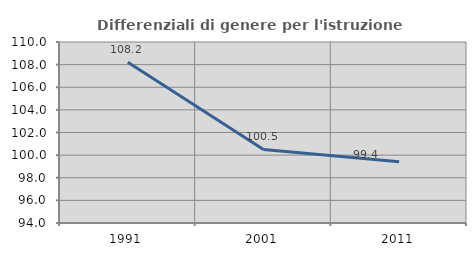
| Category | Differenziali di genere per l'istruzione superiore |
|---|---|
| 1991.0 | 108.202 |
| 2001.0 | 100.501 |
| 2011.0 | 99.414 |